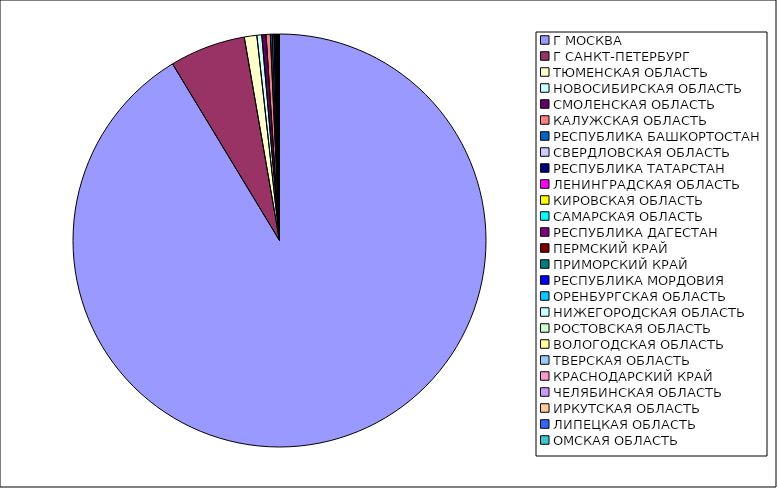
| Category | Оборот |
|---|---|
| Г МОСКВА | 0.913 |
| Г САНКТ-ПЕТЕРБУРГ | 0.059 |
| ТЮМЕНСКАЯ ОБЛАСТЬ | 0.01 |
| НОВОСИБИРСКАЯ ОБЛАСТЬ | 0.004 |
| СМОЛЕНСКАЯ ОБЛАСТЬ | 0.003 |
| КАЛУЖСКАЯ ОБЛАСТЬ | 0.003 |
| РЕСПУБЛИКА БАШКОРТОСТАН | 0.001 |
| СВЕРДЛОВСКАЯ ОБЛАСТЬ | 0.001 |
| РЕСПУБЛИКА ТАТАРСТАН | 0.001 |
| ЛЕНИНГРАДСКАЯ ОБЛАСТЬ | 0.001 |
| КИРОВСКАЯ ОБЛАСТЬ | 0 |
| САМАРСКАЯ ОБЛАСТЬ | 0 |
| РЕСПУБЛИКА ДАГЕСТАН | 0 |
| ПЕРМСКИЙ КРАЙ | 0 |
| ПРИМОРСКИЙ КРАЙ | 0 |
| РЕСПУБЛИКА МОРДОВИЯ | 0 |
| ОРЕНБУРГСКАЯ ОБЛАСТЬ | 0 |
| НИЖЕГОРОДСКАЯ ОБЛАСТЬ | 0 |
| РОСТОВСКАЯ ОБЛАСТЬ | 0 |
| ВОЛОГОДСКАЯ ОБЛАСТЬ | 0 |
| ТВЕРСКАЯ ОБЛАСТЬ | 0 |
| КРАСНОДАРСКИЙ КРАЙ | 0 |
| ЧЕЛЯБИНСКАЯ ОБЛАСТЬ | 0 |
| ИРКУТСКАЯ ОБЛАСТЬ | 0 |
| ЛИПЕЦКАЯ ОБЛАСТЬ | 0 |
| ОМСКАЯ ОБЛАСТЬ | 0 |